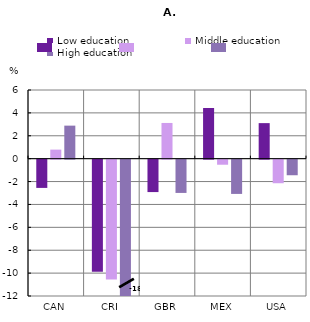
| Category | Low education | Middle education | High education |
|---|---|---|---|
| CAN | -2.468 | 0.792 | 2.886 |
| CRI | -9.786 | -10.466 | -18.099 |
| GBR | -2.832 | 3.119 | -2.906 |
| MEX | 4.425 | -0.442 | -2.993 |
| USA | 3.106 | -2.059 | -1.361 |